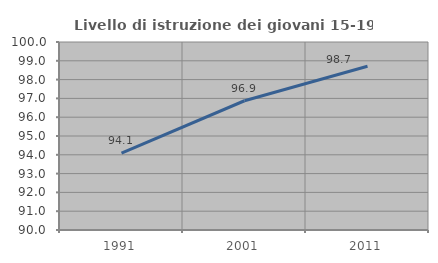
| Category | Livello di istruzione dei giovani 15-19 anni |
|---|---|
| 1991.0 | 94.091 |
| 2001.0 | 96.875 |
| 2011.0 | 98.71 |